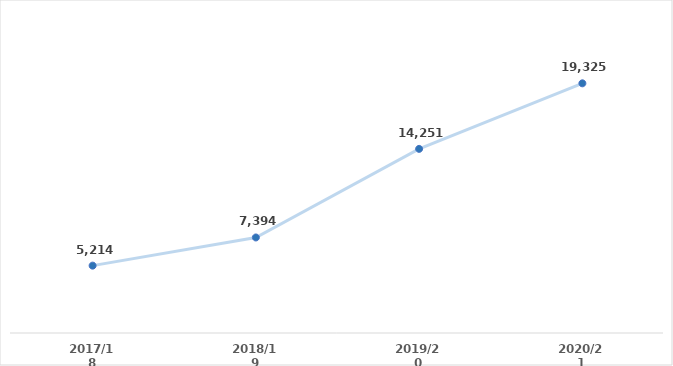
| Category | Series 0 |
|---|---|
| 2017/18 | 5214 |
| 2018/19 | 7394 |
| 2019/20 | 14251 |
| 2020/21 | 19325 |